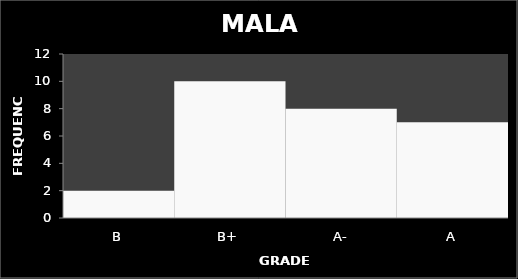
| Category | Series 0 |
|---|---|
| B | 2 |
| B+ | 10 |
| A- | 8 |
| A | 7 |